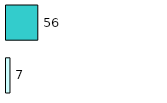
| Category | Series 0 | Series 1 |
|---|---|---|
| 0 | 7 | 56 |